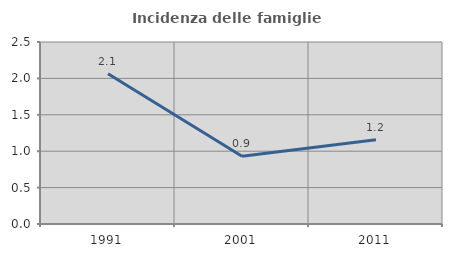
| Category | Incidenza delle famiglie numerose |
|---|---|
| 1991.0 | 2.064 |
| 2001.0 | 0.93 |
| 2011.0 | 1.157 |